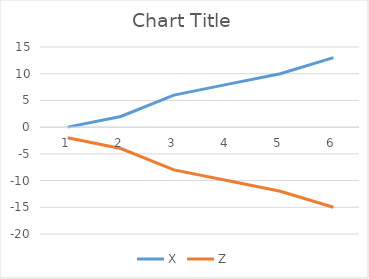
| Category | X | Z |
|---|---|---|
| 0 | 0 | -2 |
| 1 | 2 | -4 |
| 2 | 6 | -8 |
| 3 | 8 | -10 |
| 4 | 10 | -12 |
| 5 | 13 | -15 |